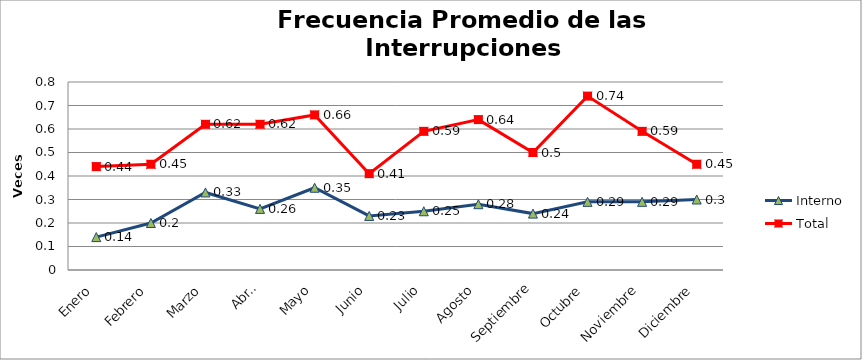
| Category | Interno | Total |
|---|---|---|
| Enero | 0.14 | 0.44 |
| Febrero | 0.2 | 0.45 |
| Marzo | 0.33 | 0.62 |
| Abril | 0.26 | 0.62 |
| Mayo | 0.35 | 0.66 |
| Junio | 0.23 | 0.41 |
| Julio | 0.25 | 0.59 |
| Agosto | 0.28 | 0.64 |
| Septiembre | 0.24 | 0.5 |
| Octubre | 0.29 | 0.74 |
| Noviembre | 0.29 | 0.59 |
| Diciembre | 0.3 | 0.45 |